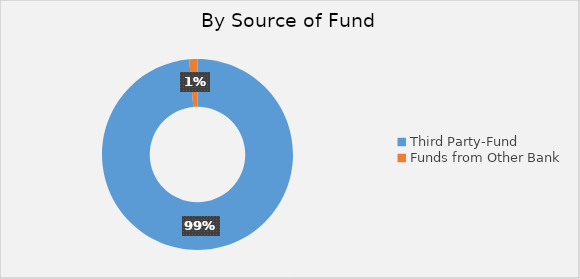
| Category | C. Source of Fund |
|---|---|
| Third Party-Fund  | 6598.46 |
| Funds from Other Bank  | 93.044 |